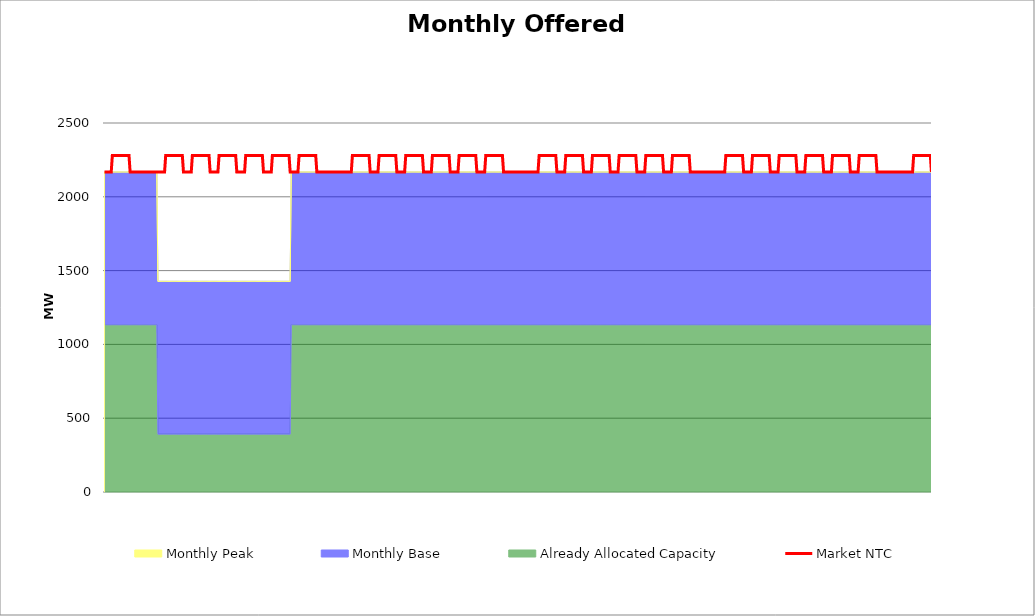
| Category | Market NTC |
|---|---|
| 0 | 2168 |
| 1 | 2168 |
| 2 | 2168 |
| 3 | 2168 |
| 4 | 2168 |
| 5 | 2168 |
| 6 | 2168 |
| 7 | 2279 |
| 8 | 2279 |
| 9 | 2279 |
| 10 | 2279 |
| 11 | 2279 |
| 12 | 2279 |
| 13 | 2279 |
| 14 | 2279 |
| 15 | 2279 |
| 16 | 2279 |
| 17 | 2279 |
| 18 | 2279 |
| 19 | 2279 |
| 20 | 2279 |
| 21 | 2279 |
| 22 | 2279 |
| 23 | 2168 |
| 24 | 2168 |
| 25 | 2168 |
| 26 | 2168 |
| 27 | 2168 |
| 28 | 2168 |
| 29 | 2168 |
| 30 | 2168 |
| 31 | 2168 |
| 32 | 2168 |
| 33 | 2168 |
| 34 | 2168 |
| 35 | 2168 |
| 36 | 2168 |
| 37 | 2168 |
| 38 | 2168 |
| 39 | 2168 |
| 40 | 2168 |
| 41 | 2168 |
| 42 | 2168 |
| 43 | 2168 |
| 44 | 2168 |
| 45 | 2168 |
| 46 | 2168 |
| 47 | 2168 |
| 48 | 2168 |
| 49 | 2168 |
| 50 | 2168 |
| 51 | 2168 |
| 52 | 2168 |
| 53 | 2168 |
| 54 | 2168 |
| 55 | 2279 |
| 56 | 2279 |
| 57 | 2279 |
| 58 | 2279 |
| 59 | 2279 |
| 60 | 2279 |
| 61 | 2279 |
| 62 | 2279 |
| 63 | 2279 |
| 64 | 2279 |
| 65 | 2279 |
| 66 | 2279 |
| 67 | 2279 |
| 68 | 2279 |
| 69 | 2279 |
| 70 | 2279 |
| 71 | 2168 |
| 72 | 2168 |
| 73 | 2168 |
| 74 | 2168 |
| 75 | 2168 |
| 76 | 2168 |
| 77 | 2168 |
| 78 | 2168 |
| 79 | 2279 |
| 80 | 2279 |
| 81 | 2279 |
| 82 | 2279 |
| 83 | 2279 |
| 84 | 2279 |
| 85 | 2279 |
| 86 | 2279 |
| 87 | 2279 |
| 88 | 2279 |
| 89 | 2279 |
| 90 | 2279 |
| 91 | 2279 |
| 92 | 2279 |
| 93 | 2279 |
| 94 | 2279 |
| 95 | 2168 |
| 96 | 2168 |
| 97 | 2168 |
| 98 | 2168 |
| 99 | 2168 |
| 100 | 2168 |
| 101 | 2168 |
| 102 | 2168 |
| 103 | 2279 |
| 104 | 2279 |
| 105 | 2279 |
| 106 | 2279 |
| 107 | 2279 |
| 108 | 2279 |
| 109 | 2279 |
| 110 | 2279 |
| 111 | 2279 |
| 112 | 2279 |
| 113 | 2279 |
| 114 | 2279 |
| 115 | 2279 |
| 116 | 2279 |
| 117 | 2279 |
| 118 | 2279 |
| 119 | 2168 |
| 120 | 2168 |
| 121 | 2168 |
| 122 | 2168 |
| 123 | 2168 |
| 124 | 2168 |
| 125 | 2168 |
| 126 | 2168 |
| 127 | 2279 |
| 128 | 2279 |
| 129 | 2279 |
| 130 | 2279 |
| 131 | 2279 |
| 132 | 2279 |
| 133 | 2279 |
| 134 | 2279 |
| 135 | 2279 |
| 136 | 2279 |
| 137 | 2279 |
| 138 | 2279 |
| 139 | 2279 |
| 140 | 2279 |
| 141 | 2279 |
| 142 | 2279 |
| 143 | 2168 |
| 144 | 2168 |
| 145 | 2168 |
| 146 | 2168 |
| 147 | 2168 |
| 148 | 2168 |
| 149 | 2168 |
| 150 | 2168 |
| 151 | 2279 |
| 152 | 2279 |
| 153 | 2279 |
| 154 | 2279 |
| 155 | 2279 |
| 156 | 2279 |
| 157 | 2279 |
| 158 | 2279 |
| 159 | 2279 |
| 160 | 2279 |
| 161 | 2279 |
| 162 | 2279 |
| 163 | 2279 |
| 164 | 2279 |
| 165 | 2279 |
| 166 | 2279 |
| 167 | 2168 |
| 168 | 2168 |
| 169 | 2168 |
| 170 | 2168 |
| 171 | 2168 |
| 172 | 2168 |
| 173 | 2168 |
| 174 | 2168 |
| 175 | 2279 |
| 176 | 2279 |
| 177 | 2279 |
| 178 | 2279 |
| 179 | 2279 |
| 180 | 2279 |
| 181 | 2279 |
| 182 | 2279 |
| 183 | 2279 |
| 184 | 2279 |
| 185 | 2279 |
| 186 | 2279 |
| 187 | 2279 |
| 188 | 2279 |
| 189 | 2279 |
| 190 | 2279 |
| 191 | 2168 |
| 192 | 2168 |
| 193 | 2168 |
| 194 | 2168 |
| 195 | 2168 |
| 196 | 2168 |
| 197 | 2168 |
| 198 | 2168 |
| 199 | 2168 |
| 200 | 2168 |
| 201 | 2168 |
| 202 | 2168 |
| 203 | 2168 |
| 204 | 2168 |
| 205 | 2168 |
| 206 | 2168 |
| 207 | 2168 |
| 208 | 2168 |
| 209 | 2168 |
| 210 | 2168 |
| 211 | 2168 |
| 212 | 2168 |
| 213 | 2168 |
| 214 | 2168 |
| 215 | 2168 |
| 216 | 2168 |
| 217 | 2168 |
| 218 | 2168 |
| 219 | 2168 |
| 220 | 2168 |
| 221 | 2168 |
| 222 | 2168 |
| 223 | 2279 |
| 224 | 2279 |
| 225 | 2279 |
| 226 | 2279 |
| 227 | 2279 |
| 228 | 2279 |
| 229 | 2279 |
| 230 | 2279 |
| 231 | 2279 |
| 232 | 2279 |
| 233 | 2279 |
| 234 | 2279 |
| 235 | 2279 |
| 236 | 2279 |
| 237 | 2279 |
| 238 | 2279 |
| 239 | 2168 |
| 240 | 2168 |
| 241 | 2168 |
| 242 | 2168 |
| 243 | 2168 |
| 244 | 2168 |
| 245 | 2168 |
| 246 | 2168 |
| 247 | 2279 |
| 248 | 2279 |
| 249 | 2279 |
| 250 | 2279 |
| 251 | 2279 |
| 252 | 2279 |
| 253 | 2279 |
| 254 | 2279 |
| 255 | 2279 |
| 256 | 2279 |
| 257 | 2279 |
| 258 | 2279 |
| 259 | 2279 |
| 260 | 2279 |
| 261 | 2279 |
| 262 | 2279 |
| 263 | 2168 |
| 264 | 2168 |
| 265 | 2168 |
| 266 | 2168 |
| 267 | 2168 |
| 268 | 2168 |
| 269 | 2168 |
| 270 | 2168 |
| 271 | 2279 |
| 272 | 2279 |
| 273 | 2279 |
| 274 | 2279 |
| 275 | 2279 |
| 276 | 2279 |
| 277 | 2279 |
| 278 | 2279 |
| 279 | 2279 |
| 280 | 2279 |
| 281 | 2279 |
| 282 | 2279 |
| 283 | 2279 |
| 284 | 2279 |
| 285 | 2279 |
| 286 | 2279 |
| 287 | 2168 |
| 288 | 2168 |
| 289 | 2168 |
| 290 | 2168 |
| 291 | 2168 |
| 292 | 2168 |
| 293 | 2168 |
| 294 | 2168 |
| 295 | 2279 |
| 296 | 2279 |
| 297 | 2279 |
| 298 | 2279 |
| 299 | 2279 |
| 300 | 2279 |
| 301 | 2279 |
| 302 | 2279 |
| 303 | 2279 |
| 304 | 2279 |
| 305 | 2279 |
| 306 | 2279 |
| 307 | 2279 |
| 308 | 2279 |
| 309 | 2279 |
| 310 | 2279 |
| 311 | 2168 |
| 312 | 2168 |
| 313 | 2168 |
| 314 | 2168 |
| 315 | 2168 |
| 316 | 2168 |
| 317 | 2168 |
| 318 | 2168 |
| 319 | 2279 |
| 320 | 2279 |
| 321 | 2279 |
| 322 | 2279 |
| 323 | 2279 |
| 324 | 2279 |
| 325 | 2279 |
| 326 | 2279 |
| 327 | 2279 |
| 328 | 2279 |
| 329 | 2279 |
| 330 | 2279 |
| 331 | 2279 |
| 332 | 2279 |
| 333 | 2279 |
| 334 | 2279 |
| 335 | 2168 |
| 336 | 2168 |
| 337 | 2168 |
| 338 | 2168 |
| 339 | 2168 |
| 340 | 2168 |
| 341 | 2168 |
| 342 | 2168 |
| 343 | 2279 |
| 344 | 2279 |
| 345 | 2279 |
| 346 | 2279 |
| 347 | 2279 |
| 348 | 2279 |
| 349 | 2279 |
| 350 | 2279 |
| 351 | 2279 |
| 352 | 2279 |
| 353 | 2279 |
| 354 | 2279 |
| 355 | 2279 |
| 356 | 2279 |
| 357 | 2279 |
| 358 | 2279 |
| 359 | 2168 |
| 360 | 2168 |
| 361 | 2168 |
| 362 | 2168 |
| 363 | 2168 |
| 364 | 2168 |
| 365 | 2168 |
| 366 | 2168 |
| 367 | 2168 |
| 368 | 2168 |
| 369 | 2168 |
| 370 | 2168 |
| 371 | 2168 |
| 372 | 2168 |
| 373 | 2168 |
| 374 | 2168 |
| 375 | 2168 |
| 376 | 2168 |
| 377 | 2168 |
| 378 | 2168 |
| 379 | 2168 |
| 380 | 2168 |
| 381 | 2168 |
| 382 | 2168 |
| 383 | 2168 |
| 384 | 2168 |
| 385 | 2168 |
| 386 | 2168 |
| 387 | 2168 |
| 388 | 2168 |
| 389 | 2168 |
| 390 | 2168 |
| 391 | 2279 |
| 392 | 2279 |
| 393 | 2279 |
| 394 | 2279 |
| 395 | 2279 |
| 396 | 2279 |
| 397 | 2279 |
| 398 | 2279 |
| 399 | 2279 |
| 400 | 2279 |
| 401 | 2279 |
| 402 | 2279 |
| 403 | 2279 |
| 404 | 2279 |
| 405 | 2279 |
| 406 | 2279 |
| 407 | 2168 |
| 408 | 2168 |
| 409 | 2168 |
| 410 | 2168 |
| 411 | 2168 |
| 412 | 2168 |
| 413 | 2168 |
| 414 | 2168 |
| 415 | 2279 |
| 416 | 2279 |
| 417 | 2279 |
| 418 | 2279 |
| 419 | 2279 |
| 420 | 2279 |
| 421 | 2279 |
| 422 | 2279 |
| 423 | 2279 |
| 424 | 2279 |
| 425 | 2279 |
| 426 | 2279 |
| 427 | 2279 |
| 428 | 2279 |
| 429 | 2279 |
| 430 | 2279 |
| 431 | 2168 |
| 432 | 2168 |
| 433 | 2168 |
| 434 | 2168 |
| 435 | 2168 |
| 436 | 2168 |
| 437 | 2168 |
| 438 | 2168 |
| 439 | 2279 |
| 440 | 2279 |
| 441 | 2279 |
| 442 | 2279 |
| 443 | 2279 |
| 444 | 2279 |
| 445 | 2279 |
| 446 | 2279 |
| 447 | 2279 |
| 448 | 2279 |
| 449 | 2279 |
| 450 | 2279 |
| 451 | 2279 |
| 452 | 2279 |
| 453 | 2279 |
| 454 | 2279 |
| 455 | 2168 |
| 456 | 2168 |
| 457 | 2168 |
| 458 | 2168 |
| 459 | 2168 |
| 460 | 2168 |
| 461 | 2168 |
| 462 | 2168 |
| 463 | 2279 |
| 464 | 2279 |
| 465 | 2279 |
| 466 | 2279 |
| 467 | 2279 |
| 468 | 2279 |
| 469 | 2279 |
| 470 | 2279 |
| 471 | 2279 |
| 472 | 2279 |
| 473 | 2279 |
| 474 | 2279 |
| 475 | 2279 |
| 476 | 2279 |
| 477 | 2279 |
| 478 | 2279 |
| 479 | 2168 |
| 480 | 2168 |
| 481 | 2168 |
| 482 | 2168 |
| 483 | 2168 |
| 484 | 2168 |
| 485 | 2168 |
| 486 | 2168 |
| 487 | 2279 |
| 488 | 2279 |
| 489 | 2279 |
| 490 | 2279 |
| 491 | 2279 |
| 492 | 2279 |
| 493 | 2279 |
| 494 | 2279 |
| 495 | 2279 |
| 496 | 2279 |
| 497 | 2279 |
| 498 | 2279 |
| 499 | 2279 |
| 500 | 2279 |
| 501 | 2279 |
| 502 | 2279 |
| 503 | 2168 |
| 504 | 2168 |
| 505 | 2168 |
| 506 | 2168 |
| 507 | 2168 |
| 508 | 2168 |
| 509 | 2168 |
| 510 | 2168 |
| 511 | 2279 |
| 512 | 2279 |
| 513 | 2279 |
| 514 | 2279 |
| 515 | 2279 |
| 516 | 2279 |
| 517 | 2279 |
| 518 | 2279 |
| 519 | 2279 |
| 520 | 2279 |
| 521 | 2279 |
| 522 | 2279 |
| 523 | 2279 |
| 524 | 2279 |
| 525 | 2279 |
| 526 | 2279 |
| 527 | 2168 |
| 528 | 2168 |
| 529 | 2168 |
| 530 | 2168 |
| 531 | 2168 |
| 532 | 2168 |
| 533 | 2168 |
| 534 | 2168 |
| 535 | 2168 |
| 536 | 2168 |
| 537 | 2168 |
| 538 | 2168 |
| 539 | 2168 |
| 540 | 2168 |
| 541 | 2168 |
| 542 | 2168 |
| 543 | 2168 |
| 544 | 2168 |
| 545 | 2168 |
| 546 | 2168 |
| 547 | 2168 |
| 548 | 2168 |
| 549 | 2168 |
| 550 | 2168 |
| 551 | 2168 |
| 552 | 2168 |
| 553 | 2168 |
| 554 | 2168 |
| 555 | 2168 |
| 556 | 2168 |
| 557 | 2168 |
| 558 | 2168 |
| 559 | 2279 |
| 560 | 2279 |
| 561 | 2279 |
| 562 | 2279 |
| 563 | 2279 |
| 564 | 2279 |
| 565 | 2279 |
| 566 | 2279 |
| 567 | 2279 |
| 568 | 2279 |
| 569 | 2279 |
| 570 | 2279 |
| 571 | 2279 |
| 572 | 2279 |
| 573 | 2279 |
| 574 | 2279 |
| 575 | 2168 |
| 576 | 2168 |
| 577 | 2168 |
| 578 | 2168 |
| 579 | 2168 |
| 580 | 2168 |
| 581 | 2168 |
| 582 | 2168 |
| 583 | 2279 |
| 584 | 2279 |
| 585 | 2279 |
| 586 | 2279 |
| 587 | 2279 |
| 588 | 2279 |
| 589 | 2279 |
| 590 | 2279 |
| 591 | 2279 |
| 592 | 2279 |
| 593 | 2279 |
| 594 | 2279 |
| 595 | 2279 |
| 596 | 2279 |
| 597 | 2279 |
| 598 | 2279 |
| 599 | 2168 |
| 600 | 2168 |
| 601 | 2168 |
| 602 | 2168 |
| 603 | 2168 |
| 604 | 2168 |
| 605 | 2168 |
| 606 | 2168 |
| 607 | 2279 |
| 608 | 2279 |
| 609 | 2279 |
| 610 | 2279 |
| 611 | 2279 |
| 612 | 2279 |
| 613 | 2279 |
| 614 | 2279 |
| 615 | 2279 |
| 616 | 2279 |
| 617 | 2279 |
| 618 | 2279 |
| 619 | 2279 |
| 620 | 2279 |
| 621 | 2279 |
| 622 | 2279 |
| 623 | 2168 |
| 624 | 2168 |
| 625 | 2168 |
| 626 | 2168 |
| 627 | 2168 |
| 628 | 2168 |
| 629 | 2168 |
| 630 | 2168 |
| 631 | 2279 |
| 632 | 2279 |
| 633 | 2279 |
| 634 | 2279 |
| 635 | 2279 |
| 636 | 2279 |
| 637 | 2279 |
| 638 | 2279 |
| 639 | 2279 |
| 640 | 2279 |
| 641 | 2279 |
| 642 | 2279 |
| 643 | 2279 |
| 644 | 2279 |
| 645 | 2279 |
| 646 | 2279 |
| 647 | 2168 |
| 648 | 2168 |
| 649 | 2168 |
| 650 | 2168 |
| 651 | 2168 |
| 652 | 2168 |
| 653 | 2168 |
| 654 | 2168 |
| 655 | 2279 |
| 656 | 2279 |
| 657 | 2279 |
| 658 | 2279 |
| 659 | 2279 |
| 660 | 2279 |
| 661 | 2279 |
| 662 | 2279 |
| 663 | 2279 |
| 664 | 2279 |
| 665 | 2279 |
| 666 | 2279 |
| 667 | 2279 |
| 668 | 2279 |
| 669 | 2279 |
| 670 | 2279 |
| 671 | 2168 |
| 672 | 2168 |
| 673 | 2168 |
| 674 | 2168 |
| 675 | 2168 |
| 676 | 2168 |
| 677 | 2168 |
| 678 | 2168 |
| 679 | 2279 |
| 680 | 2279 |
| 681 | 2279 |
| 682 | 2279 |
| 683 | 2279 |
| 684 | 2279 |
| 685 | 2279 |
| 686 | 2279 |
| 687 | 2279 |
| 688 | 2279 |
| 689 | 2279 |
| 690 | 2279 |
| 691 | 2279 |
| 692 | 2279 |
| 693 | 2279 |
| 694 | 2279 |
| 695 | 2168 |
| 696 | 2168 |
| 697 | 2168 |
| 698 | 2168 |
| 699 | 2168 |
| 700 | 2168 |
| 701 | 2168 |
| 702 | 2168 |
| 703 | 2168 |
| 704 | 2168 |
| 705 | 2168 |
| 706 | 2168 |
| 707 | 2168 |
| 708 | 2168 |
| 709 | 2168 |
| 710 | 2168 |
| 711 | 2168 |
| 712 | 2168 |
| 713 | 2168 |
| 714 | 2168 |
| 715 | 2168 |
| 716 | 2168 |
| 717 | 2168 |
| 718 | 2168 |
| 719 | 2168 |
| 720 | 2168 |
| 721 | 2168 |
| 722 | 2168 |
| 723 | 2168 |
| 724 | 2168 |
| 725 | 2168 |
| 726 | 2168 |
| 727 | 2168 |
| 728 | 2279 |
| 729 | 2279 |
| 730 | 2279 |
| 731 | 2279 |
| 732 | 2279 |
| 733 | 2279 |
| 734 | 2279 |
| 735 | 2279 |
| 736 | 2279 |
| 737 | 2279 |
| 738 | 2279 |
| 739 | 2279 |
| 740 | 2279 |
| 741 | 2279 |
| 742 | 2279 |
| 743 | 2279 |
| 744 | 2168 |